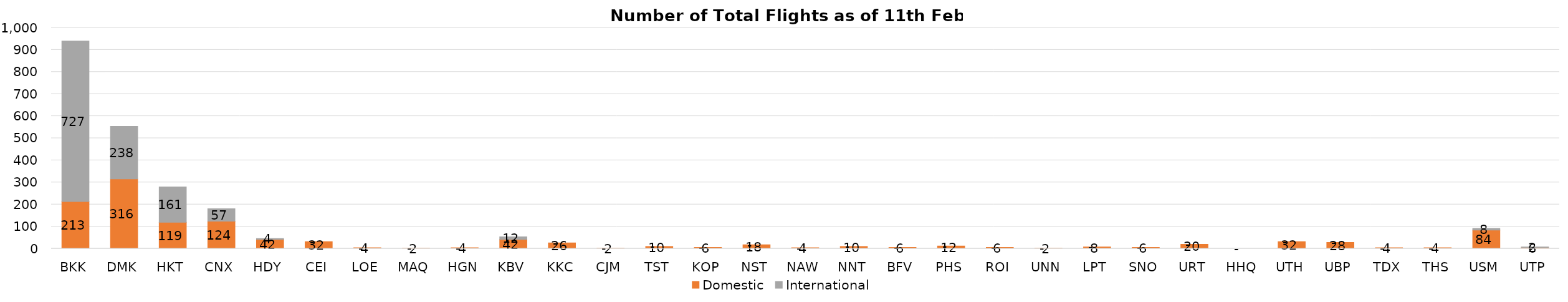
| Category | Domestic | International |
|---|---|---|
| BKK | 213 | 727 |
| DMK | 316 | 238 |
| HKT | 119 | 161 |
| CNX | 124 | 57 |
| HDY | 42 | 4 |
| CEI | 32 | 0 |
| LOE | 4 | 0 |
| MAQ | 2 | 0 |
| HGN | 4 | 0 |
| KBV | 42 | 12 |
| KKC | 26 | 0 |
| CJM | 2 | 0 |
| TST | 10 | 0 |
| KOP | 6 | 0 |
| NST | 18 | 0 |
| NAW | 4 | 0 |
| NNT | 10 | 0 |
| BFV | 6 | 0 |
| PHS | 12 | 0 |
| ROI | 6 | 0 |
| UNN | 2 | 0 |
| LPT | 8 | 0 |
| SNO | 6 | 0 |
| URT | 20 | 0 |
| HHQ | 0 | 0 |
| UTH | 32 | 0 |
| UBP | 28 | 0 |
| TDX | 4 | 0 |
| THS | 4 | 0 |
| USM | 84 | 8 |
| UTP | 6 | 2 |